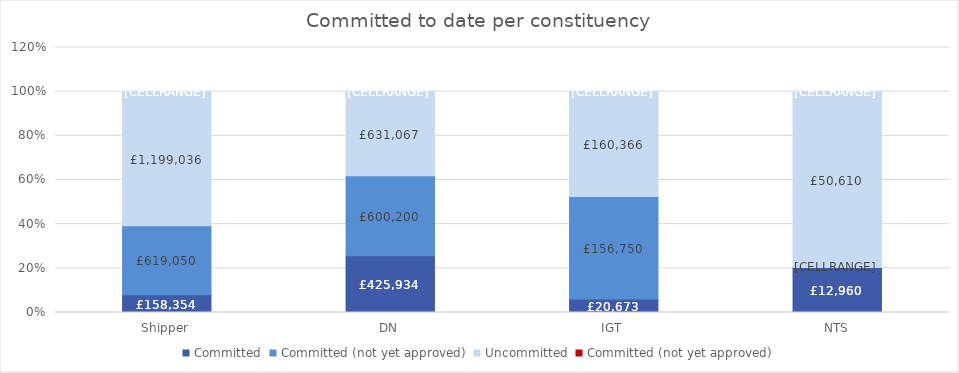
| Category | Committed | Committed (not yet approved) | Uncommitted |
|---|---|---|---|
| Shipper | 0.08 | 0 | 0.607 |
| DN | 0.257 | 0 | 0.381 |
| IGT | 0.061 | 0 | 0.475 |
| NTS | 0.204 | 0 | 0.796 |